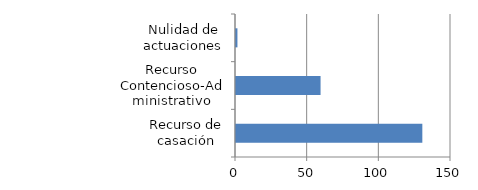
| Category | Series 0 |
|---|---|
| Recurso de casación | 130 |
| Recurso Contencioso-Administrativo | 59 |
| Nulidad de actuaciones | 1 |